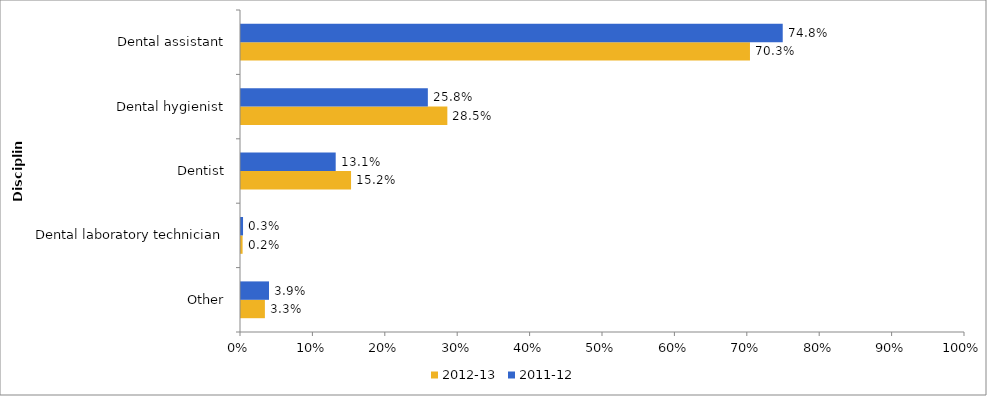
| Category | 2012-13 | 2011-12 |
|---|---|---|
| Other | 0.033 | 0.039 |
| Dental laboratory technician | 0.002 | 0.003 |
| Dentist | 0.152 | 0.131 |
| Dental hygienist | 0.285 | 0.258 |
| Dental assistant | 0.703 | 0.748 |